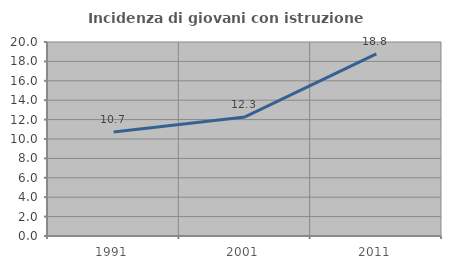
| Category | Incidenza di giovani con istruzione universitaria |
|---|---|
| 1991.0 | 10.721 |
| 2001.0 | 12.277 |
| 2011.0 | 18.785 |